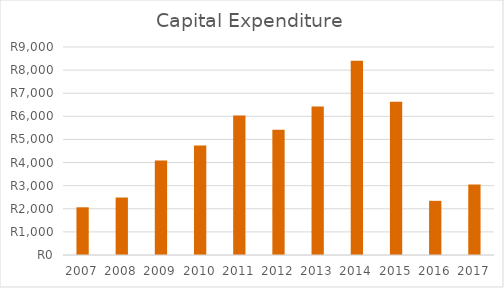
| Category | Capital Expenditure |
|---|---|
| 2007.0 | 2064 |
| 2008.0 | 2487 |
| 2009.0 | 4087 |
| 2010.0 | 4733 |
| 2011.0 | 6034 |
| 2012.0 | 5418 |
| 2013.0 | 6428 |
| 2014.0 | 8404 |
| 2015.0 | 6627 |
| 2016.0 | 2344 |
| 2017.0 | 3047 |